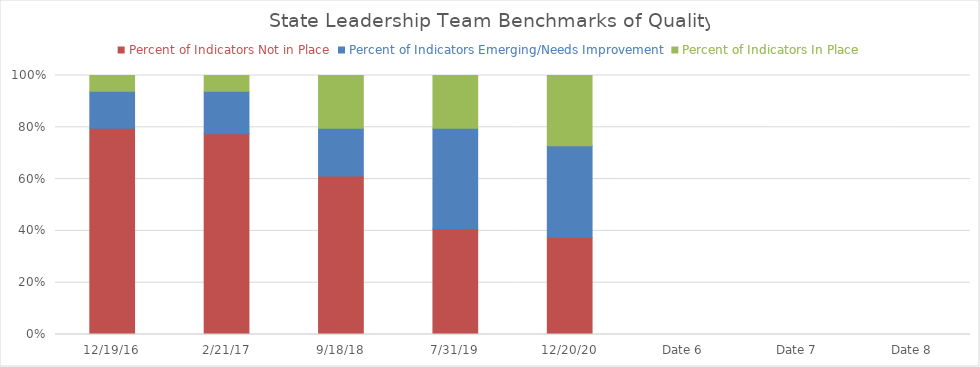
| Category | Percent of Indicators Not in Place | Percent of Indicators Emerging/Needs Improvement | Percent of Indicators In Place |
|---|---|---|---|
| 12/19/16 | 0.796 | 0.143 | 0.061 |
| 2/21/17 | 0.776 | 0.163 | 0.061 |
| 9/18/18 | 0.612 | 0.184 | 0.204 |
| 7/31/19 | 0.408 | 0.388 | 0.204 |
| 12/20/20 | 0.367 | 0.347 | 0.265 |
| Date 6 | 0 | 0 | 0 |
| Date 7 | 0 | 0 | 0 |
| Date 8 | 0 | 0 | 0 |